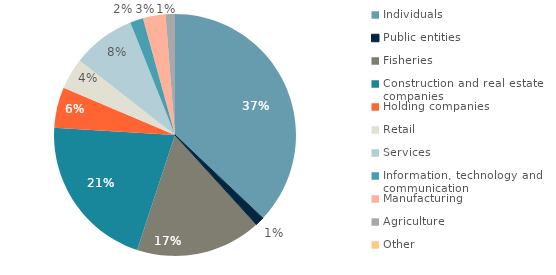
| Category | Series 0 |
|---|---|
| Individuals | 310411 |
| Public entities | 9932 |
| Fisheries | 140865 |
| Construction and real estate companies  | 174777 |
| Holding companies | 45512 |
| Retail | 35194 |
| Services | 70425 |
| Information, technology and communication | 14608 |
| Manufacturing | 25306 |
| Agriculture | 10464 |
| Other | 0 |